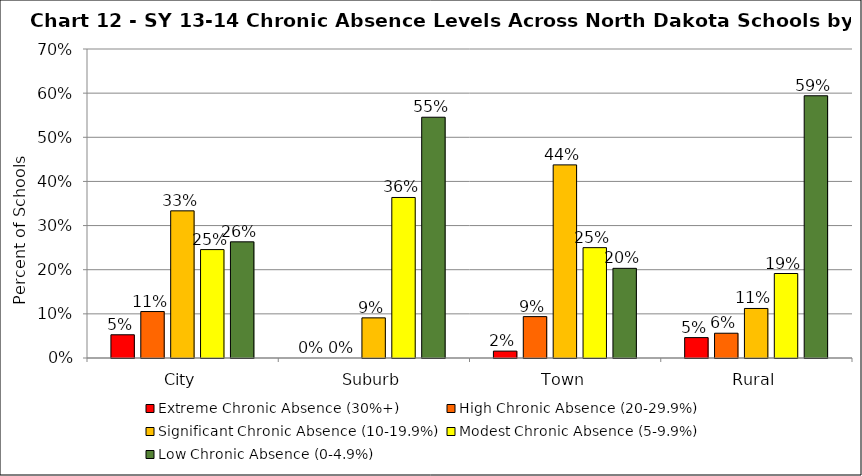
| Category | Extreme Chronic Absence (30%+) | High Chronic Absence (20-29.9%) | Significant Chronic Absence (10-19.9%) | Modest Chronic Absence (5-9.9%) | Low Chronic Absence (0-4.9%) |
|---|---|---|---|---|---|
| 0 | 0.053 | 0.105 | 0.333 | 0.246 | 0.263 |
| 1 | 0 | 0 | 0.091 | 0.364 | 0.545 |
| 2 | 0.016 | 0.094 | 0.438 | 0.25 | 0.203 |
| 3 | 0.046 | 0.056 | 0.112 | 0.191 | 0.594 |